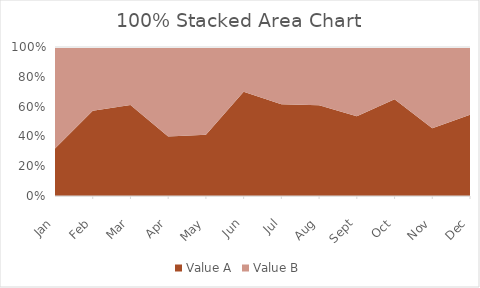
| Category | Value A | Value B |
|---|---|---|
| 2017-01-01 | 7 | 15 |
| 2017-02-01 | 8 | 6 |
| 2017-03-01 | 11 | 7 |
| 2017-04-01 | 6 | 9 |
| 2017-05-01 | 7 | 10 |
| 2017-06-01 | 14 | 6 |
| 2017-07-01 | 8 | 5 |
| 2017-08-01 | 14 | 9 |
| 2017-09-01 | 15 | 13 |
| 2017-10-01 | 13 | 7 |
| 2017-11-01 | 5 | 6 |
| 2017-12-01 | 12 | 10 |